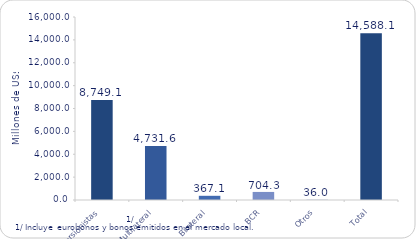
| Category | Series 1 |
|---|---|
| Inversionistas | 8749.1 |
| Multilateral | 4731.6 |
| Bilateral | 367.1 |
| BCR | 704.3 |
| Otros | 36 |
| Total | 14588.1 |